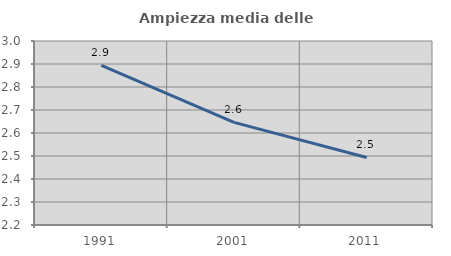
| Category | Ampiezza media delle famiglie |
|---|---|
| 1991.0 | 2.894 |
| 2001.0 | 2.646 |
| 2011.0 | 2.494 |